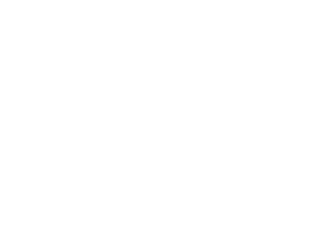
| Category | Series 0 |
|---|---|
| Ingresos | 0 |
| Gastos | 0 |
| Ahorros | 0 |